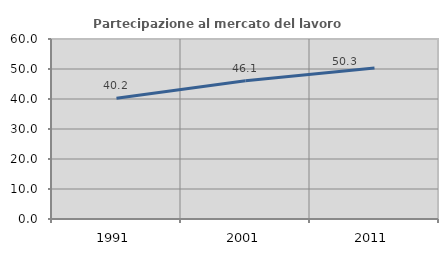
| Category | Partecipazione al mercato del lavoro  femminile |
|---|---|
| 1991.0 | 40.246 |
| 2001.0 | 46.095 |
| 2011.0 | 50.325 |